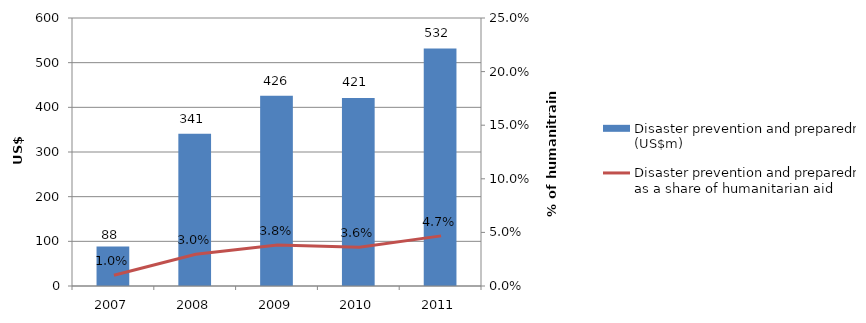
| Category | Disaster prevention and preparedness (US$m) |
|---|---|
| 2007.0 | 88.181 |
| 2008.0 | 340.888 |
| 2009.0 | 426.103 |
| 2010.0 | 421.019 |
| 2011.0 | 531.964 |